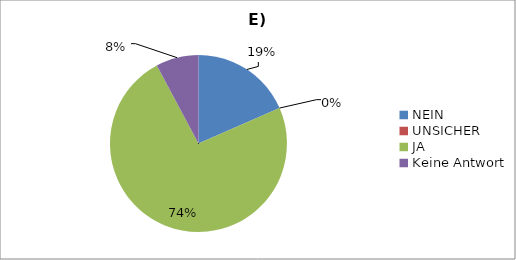
| Category | Series 0 |
|---|---|
| NEIN | 26 |
| UNSICHER | 0 |
| JA | 104 |
| Keine Antwort | 11 |